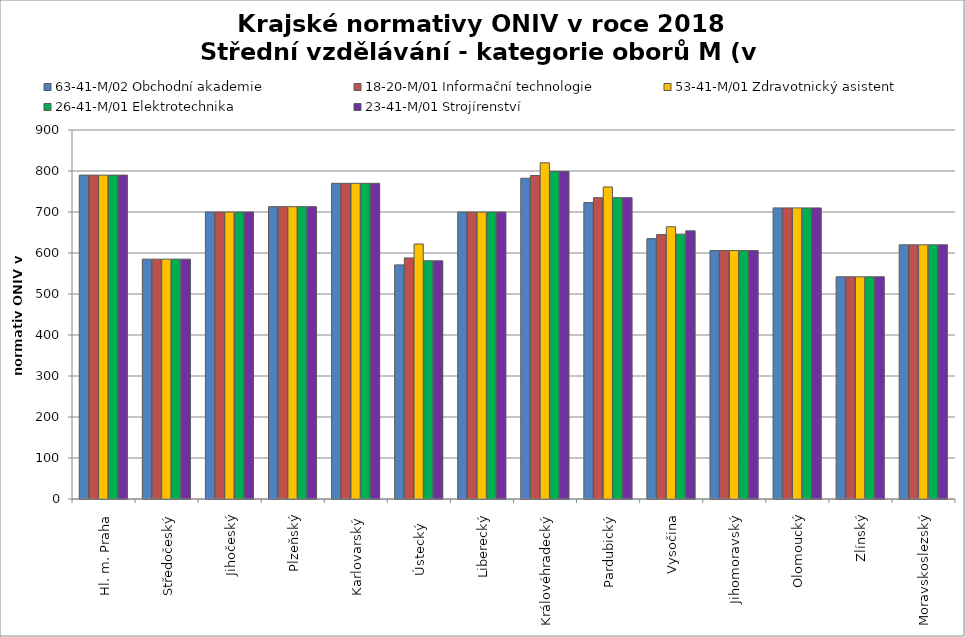
| Category | 63-41-M/02 Obchodní akademie | 18-20-M/01 Informační technologie | 53-41-M/01 Zdravotnický asistent | 26-41-M/01 Elektrotechnika | 23-41-M/01 Strojírenství |
|---|---|---|---|---|---|
| Hl. m. Praha | 790 | 790 | 790 | 790 | 790 |
| Středočeský | 585 | 585 | 585 | 585 | 585 |
| Jihočeský | 700 | 700 | 700 | 700 | 700 |
| Plzeňský | 713 | 713 | 713 | 713 | 713 |
| Karlovarský  | 770 | 770 | 770 | 770 | 770 |
| Ústecký   | 571 | 588 | 622 | 581 | 581 |
| Liberecký | 700 | 700 | 700 | 700 | 700 |
| Královéhradecký | 782.3 | 789 | 819.9 | 799 | 799 |
| Pardubický | 723 | 735 | 761 | 735 | 735 |
| Vysočina | 635 | 645 | 664 | 646 | 654 |
| Jihomoravský | 606 | 606 | 606 | 606 | 606 |
| Olomoucký | 710 | 710 | 710 | 710 | 710 |
| Zlínský | 542 | 542 | 542 | 542 | 542 |
| Moravskoslezský | 620 | 620 | 620 | 620 | 620 |